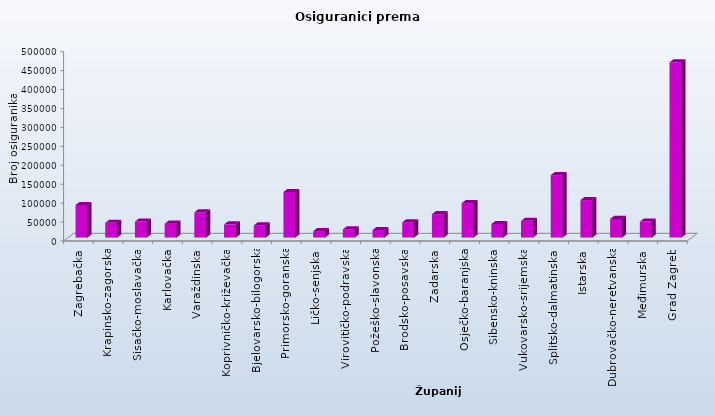
| Category | Series 0 |
|---|---|
| Zagrebačka | 85942 |
| Krapinsko-zagorska | 38943 |
| Sisačko-moslavačka | 42254 |
| Karlovačka | 36626 |
| Varaždinska | 66660 |
| Koprivničko-križevačka | 34817 |
| Bjelovarsko-bilogorska | 32112 |
| Primorsko-goranska | 120333 |
| Ličko-senjska | 16921 |
| Virovitičko-podravska | 21493 |
| Požeško-slavonska | 19893 |
| Brodsko-posavska | 40399 |
| Zadarska | 61759 |
| Osječko-baranjska | 90714 |
| Šibensko-kninska | 35687 |
| Vukovarsko-srijemska | 44059 |
| Splitsko-dalmatinska | 164869 |
| Istarska | 98986 |
| Dubrovačko-neretvanska | 49217 |
| Međimurska | 42073 |
| Grad Zagreb | 462776 |